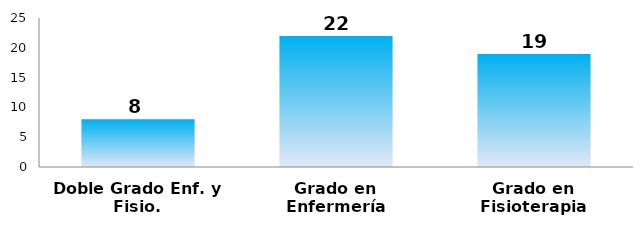
| Category | Series 0 |
|---|---|
| Doble Grado Enf. y Fisio. | 8 |
| Grado en Enfermería | 22 |
| Grado en Fisioterapia | 19 |